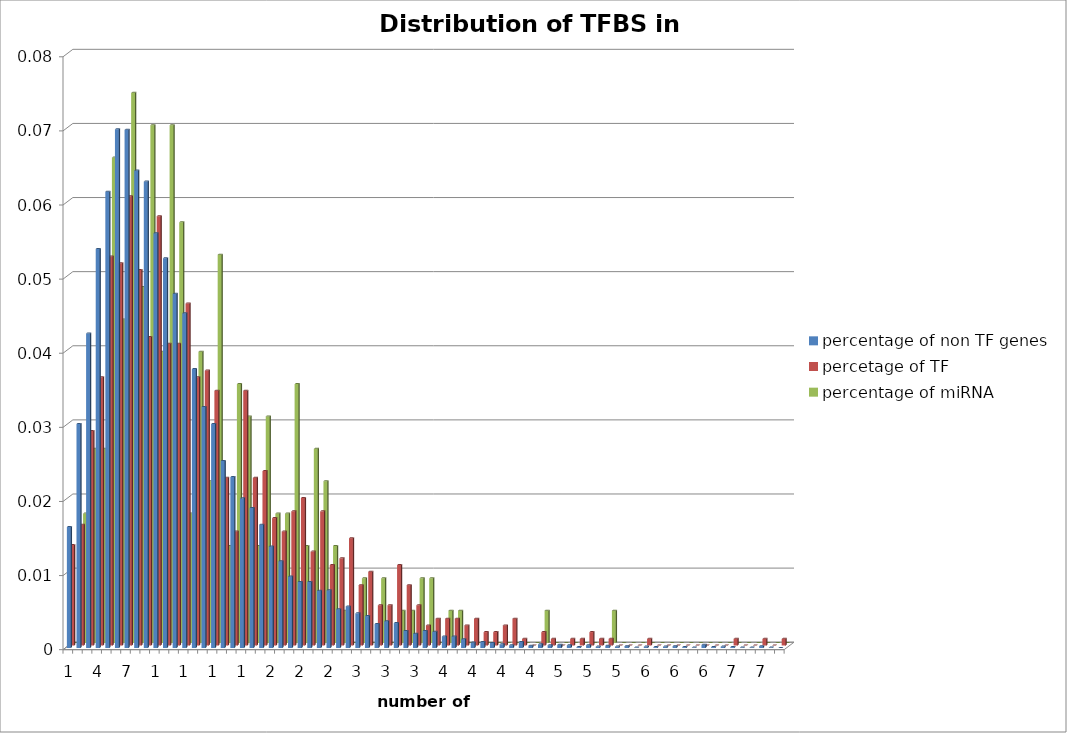
| Category | percentage of non TF genes | percetage of TF | percentage of miRNA |
|---|---|---|---|
| 0 | 0.016 | 0.014 | 0 |
| 1 | 0.03 | 0.016 | 0.017 |
| 2 | 0.042 | 0.029 | 0.026 |
| 3 | 0.054 | 0.036 | 0.026 |
| 4 | 0.062 | 0.052 | 0.066 |
| 5 | 0.07 | 0.052 | 0.044 |
| 6 | 0.07 | 0.061 | 0.074 |
| 7 | 0.064 | 0.051 | 0.048 |
| 8 | 0.063 | 0.042 | 0.07 |
| 9 | 0.056 | 0.058 | 0.039 |
| 10 | 0.053 | 0.041 | 0.07 |
| 11 | 0.048 | 0.041 | 0.057 |
| 12 | 0.045 | 0.046 | 0.017 |
| 13 | 0.038 | 0.036 | 0.039 |
| 14 | 0.033 | 0.037 | 0.022 |
| 15 | 0.03 | 0.034 | 0.052 |
| 16 | 0.025 | 0.023 | 0.013 |
| 17 | 0.023 | 0.015 | 0.035 |
| 18 | 0.02 | 0.034 | 0.031 |
| 19 | 0.019 | 0.023 | 0.013 |
| 20 | 0.017 | 0.024 | 0.031 |
| 21 | 0.014 | 0.017 | 0.017 |
| 22 | 0.012 | 0.015 | 0.017 |
| 23 | 0.01 | 0.018 | 0.035 |
| 24 | 0.009 | 0.02 | 0.013 |
| 25 | 0.009 | 0.013 | 0.026 |
| 26 | 0.008 | 0.018 | 0.022 |
| 27 | 0.008 | 0.011 | 0.013 |
| 28 | 0.005 | 0.012 | 0.004 |
| 29 | 0.006 | 0.014 | 0 |
| 30 | 0.005 | 0.008 | 0.009 |
| 31 | 0.004 | 0.01 | 0 |
| 32 | 0.003 | 0.005 | 0.009 |
| 33 | 0.004 | 0.005 | 0 |
| 34 | 0.003 | 0.011 | 0.004 |
| 35 | 0.002 | 0.008 | 0.004 |
| 36 | 0.002 | 0.005 | 0.009 |
| 37 | 0.002 | 0.003 | 0.009 |
| 38 | 0.002 | 0.004 | 0 |
| 39 | 0.002 | 0.004 | 0.004 |
| 40 | 0.002 | 0.004 | 0.004 |
| 41 | 0.001 | 0.003 | 0 |
| 42 | 0.001 | 0.004 | 0 |
| 43 | 0.001 | 0.002 | 0 |
| 44 | 0.001 | 0.002 | 0 |
| 45 | 0 | 0.003 | 0 |
| 46 | 0 | 0.004 | 0 |
| 47 | 0.001 | 0.001 | 0 |
| 48 | 0 | 0 | 0 |
| 49 | 0 | 0.002 | 0.004 |
| 50 | 0 | 0.001 | 0 |
| 51 | 0 | 0 | 0 |
| 52 | 0 | 0.001 | 0 |
| 53 | 0 | 0.001 | 0 |
| 54 | 0 | 0.002 | 0 |
| 55 | 0 | 0.001 | 0 |
| 56 | 0 | 0.001 | 0.004 |
| 57 | 0 | 0 | 0 |
| 58 | 0 | 0 | 0 |
| 59 | 0 | 0 | 0 |
| 60 | 0 | 0.001 | 0 |
| 61 | 0 | 0 | 0 |
| 62 | 0 | 0 | 0 |
| 63 | 0 | 0 | 0 |
| 64 | 0 | 0 | 0 |
| 65 | 0 | 0 | 0 |
| 66 | 0 | 0 | 0 |
| 67 | 0 | 0 | 0 |
| 68 | 0 | 0 | 0 |
| 69 | 0 | 0.001 | 0 |
| 70 | 0 | 0 | 0 |
| 71 | 0 | 0 | 0 |
| 72 | 0 | 0.001 | 0 |
| 73 | 0 | 0 | 0 |
| 74 | 0 | 0.001 | 0 |